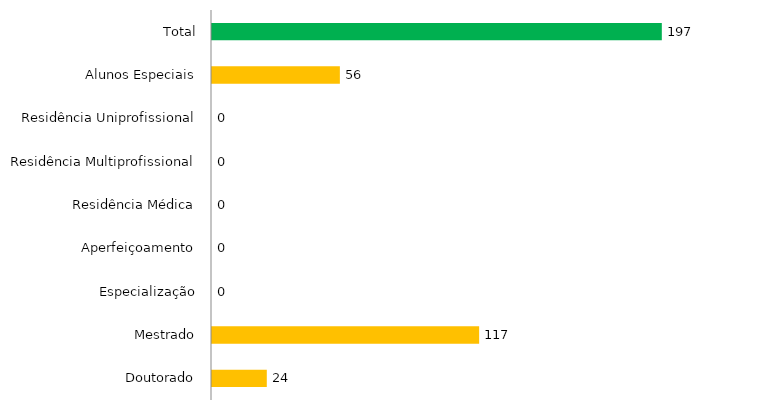
| Category | Pós - Graduação UFGD |
|---|---|
| Doutorado | 24 |
| Mestrado | 117 |
| Especialização | 0 |
| Aperfeiçoamento | 0 |
| Residência Médica | 0 |
| Residência Multiprofissional | 0 |
| Residência Uniprofissional | 0 |
| Alunos Especiais | 56 |
| Total | 197 |